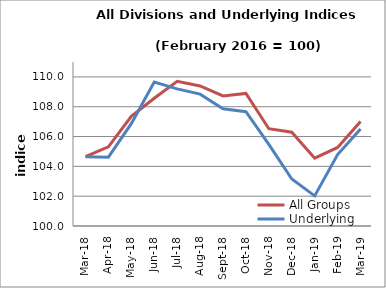
| Category | All Groups | Underlying |
|---|---|---|
| 2018-03-01 | 104.655 | 104.651 |
| 2018-04-01 | 105.309 | 104.614 |
| 2018-05-01 | 107.355 | 106.863 |
| 2018-06-01 | 108.567 | 109.659 |
| 2018-07-01 | 109.702 | 109.198 |
| 2018-08-01 | 109.392 | 108.845 |
| 2018-09-01 | 108.722 | 107.857 |
| 2018-10-01 | 108.895 | 107.664 |
| 2018-11-01 | 106.524 | 105.471 |
| 2018-12-01 | 106.292 | 103.148 |
| 2019-01-01 | 104.55 | 102.019 |
| 2019-02-01 | 105.272 | 104.794 |
| 2019-03-01 | 107.012 | 106.51 |